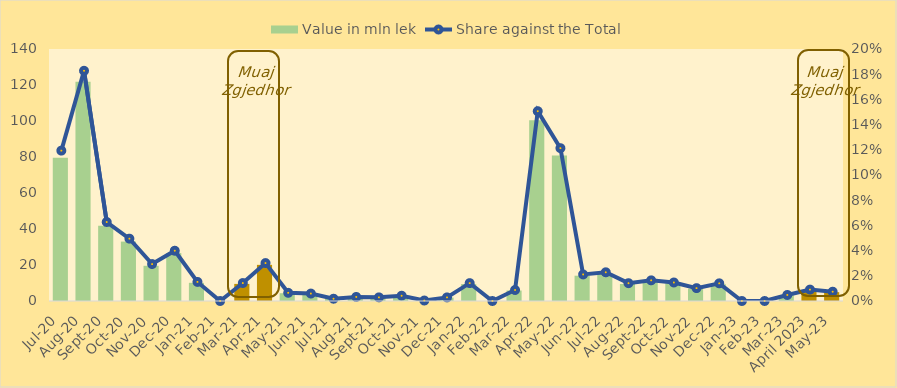
| Category | Value in mln lek |
|---|---|
| Jul-20 | 79.6 |
| Aug-20 | 121.85 |
| Sep-20 | 41.8 |
| Oct-20 | 33 |
| Nov-20 | 19.55 |
| Dec-20 | 26.602 |
| Jan-21 | 10.1 |
| Feb-21 | 0 |
| Mar-21 | 9.5 |
| Apr-21 | 20.08 |
| May-21 | 4.325 |
| Jun-21 | 3.94 |
| Jul-21 | 1.2 |
| Aug-21 | 2.15 |
| Sep-21 | 1.925 |
| Oct-21 | 2.797 |
| Nov-21 | 0.25 |
| Dec-21 | 1.9 |
| Jan-22 | 9.461 |
| Feb-22 | 0 |
| Mar-22 | 5.822 |
| Apr-22 | 100.459 |
| May-22 | 80.899 |
| Jun-22 | 14.054 |
| Jul-22 | 15.189 |
| Aug-22 | 9.437 |
| Sep-22 | 10.931 |
| Oct-22 | 9.798 |
| Nov-22 | 6.815 |
| Dec-22 | 9.352 |
| Jan-23 | 0 |
| Feb-23 | 0 |
| Mar-23 | 3.197 |
| April 2023 | 6.037 |
| May-23 | 4.919 |